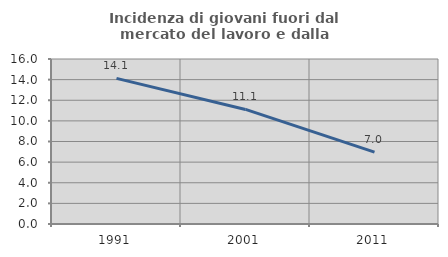
| Category | Incidenza di giovani fuori dal mercato del lavoro e dalla formazione  |
|---|---|
| 1991.0 | 14.118 |
| 2001.0 | 11.111 |
| 2011.0 | 6.977 |